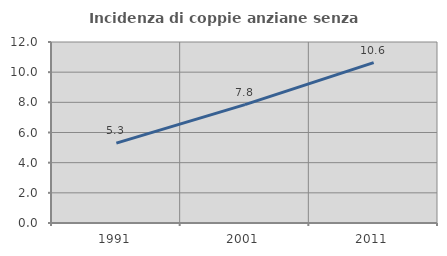
| Category | Incidenza di coppie anziane senza figli  |
|---|---|
| 1991.0 | 5.299 |
| 2001.0 | 7.846 |
| 2011.0 | 10.632 |